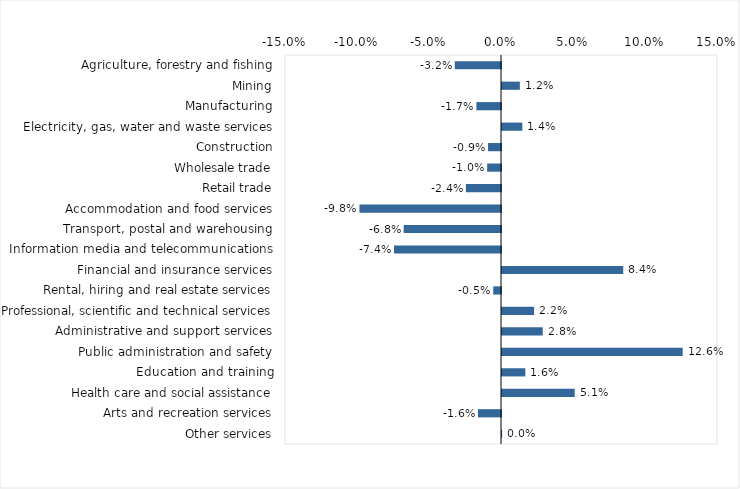
| Category | This week |
|---|---|
| Agriculture, forestry and fishing | -0.032 |
| Mining | 0.012 |
| Manufacturing | -0.017 |
| Electricity, gas, water and waste services | 0.014 |
| Construction | -0.009 |
| Wholesale trade | -0.01 |
| Retail trade | -0.024 |
| Accommodation and food services | -0.098 |
| Transport, postal and warehousing | -0.068 |
| Information media and telecommunications | -0.074 |
| Financial and insurance services | 0.084 |
| Rental, hiring and real estate services | -0.005 |
| Professional, scientific and technical services | 0.022 |
| Administrative and support services | 0.028 |
| Public administration and safety | 0.126 |
| Education and training | 0.016 |
| Health care and social assistance | 0.05 |
| Arts and recreation services | -0.016 |
| Other services | 0 |